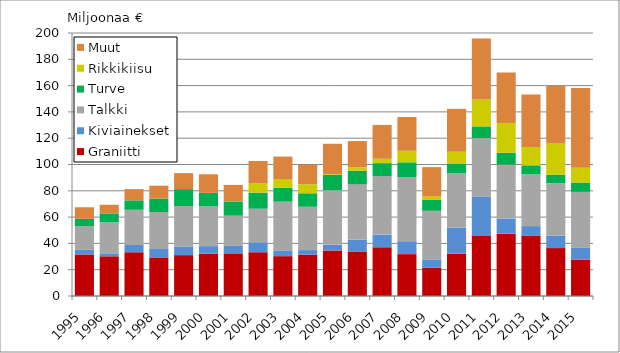
| Category | Graniitti | Kiviainekset | Talkki | Turve | Rikkikiisu | Muut |
|---|---|---|---|---|---|---|
| 1995.0 | 31597 | 3471 | 18043 | 5578 | 0 | 8788 |
| 1996.0 | 30188 | 2252 | 23644 | 6742 | 10 | 6520 |
| 1997.0 | 33258 | 5522 | 26796 | 7178 | 8 | 8527 |
| 1998.0 | 29337 | 6403 | 28133 | 10185 | 9 | 9799 |
| 1999.0 | 31087 | 6404 | 30831 | 12960 | 8 | 12163 |
| 2000.0 | 32169 | 5745 | 30336 | 10187 | 6 | 14110 |
| 2001.0 | 32416 | 5711 | 22935 | 10748 | 7 | 12687 |
| 2002.0 | 33281 | 7590 | 25501 | 12219 | 7079 | 17007 |
| 2003.0 | 30299 | 4416 | 37012 | 10541 | 6187 | 17586 |
| 2004.0 | 31437 | 3471 | 32951 | 10244 | 6922 | 14870 |
| 2005.0 | 34635 | 4266 | 41585 | 11667 | 539 | 23079 |
| 2006.0 | 33855 | 9070 | 42171 | 10142 | 2587 | 20010 |
| 2007.0 | 37069 | 9631 | 44536 | 9807 | 3301 | 25734 |
| 2008.0 | 31849 | 9831 | 48813 | 11183 | 8760 | 25665 |
| 2009.0 | 21545 | 6319 | 36943.497 | 8254.7 | 2578 | 22346 |
| 2010.0 | 32151 | 19773 | 41287.622 | 7551.521 | 8932 | 32631 |
| 2011.0 | 45602 | 30150 | 44382 | 8839 | 20510 | 46398 |
| 2012.0 | 47395 | 11505 | 41030 | 9046 | 22544 | 38470 |
| 2013.0 | 45934 | 7203 | 39324 | 6917 | 13935 | 39926 |
| 2014.0 | 36452 | 9533 | 39651 | 6633 | 23765 | 43827 |
| 2015.0 | 27676 | 9271 | 42226 | 7086 | 11267 | 60618 |